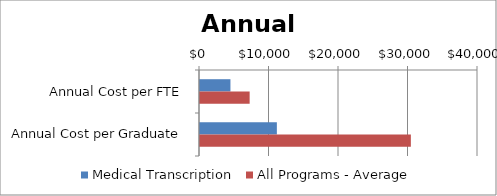
| Category | Medical Transcription | All Programs - Average |
|---|---|---|
| Annual Cost per FTE | 4380.166 | 7144 |
| Annual Cost per Graduate | 11059.92 | 30340 |